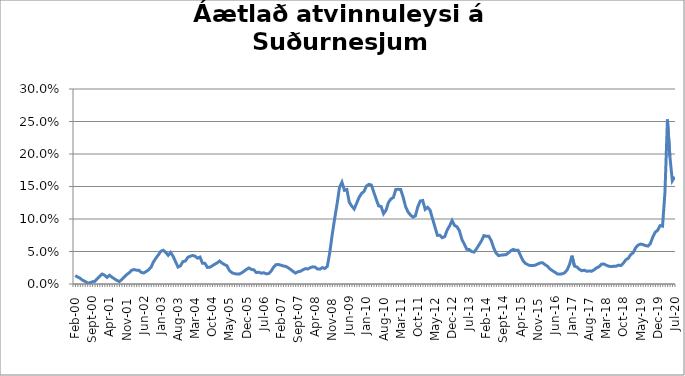
| Category | Series 0 |
|---|---|
| feb.00 | 0.013 |
| mar.00 | 0.011 |
| apr.00 | 0.009 |
| maí.00 | 0.006 |
| jún.00 | 0.004 |
| júl.00 | 0.002 |
| ágú.00 | 0.002 |
| sep.00 | 0.003 |
| okt.00 | 0.004 |
| nóv.00 | 0.008 |
| des.00 | 0.012 |
| jan.01 | 0.015 |
| feb.01 | 0.013 |
| mar.01 | 0.01 |
| apr.01 | 0.013 |
| maí.01 | 0.011 |
| jún.01 | 0.008 |
| júl.01 | 0.006 |
| ágú.01 | 0.004 |
| sep.01 | 0.007 |
| okt.01 | 0.011 |
| nóv.01 | 0.014 |
| des.01 | 0.017 |
| jan.02 | 0.021 |
| feb.02 | 0.022 |
| mar.02 | 0.021 |
| apr.02 | 0.021 |
| maí.02 | 0.018 |
| jún.02 | 0.017 |
| júl.02 | 0.019 |
| ágú.02 | 0.022 |
| sep.02 | 0.026 |
| okt.02 | 0.034 |
| nóv.02 | 0.04 |
| des.02 | 0.045 |
| jan.03 | 0.05 |
| feb.03 | 0.052 |
| mar.03 | 0.049 |
| apr.03 | 0.044 |
| maí.03 | 0.049 |
| jún.03 | 0.043 |
| júl.03 | 0.034 |
| ágú.03 | 0.026 |
| sep.03 | 0.028 |
| okt.03 | 0.034 |
| nóv.03 | 0.035 |
| des.03 | 0.041 |
| jan.04 | 0.043 |
| feb.04 | 0.044 |
| mar.04 | 0.043 |
| apr.04 | 0.04 |
| maí.04 | 0.041 |
| jún.04 | 0.032 |
| júl.04 | 0.032 |
| ágú.04 | 0.026 |
| sep.04 | 0.026 |
| okt.04 | 0.028 |
| nóv.04 | 0.03 |
| des.04 | 0.032 |
| jan.05 | 0.035 |
| feb.05 | 0.032 |
| mar.05 | 0.03 |
| apr.05 | 0.028 |
| maí.05 | 0.021 |
| jún.05 | 0.018 |
| júl.05 | 0.016 |
| ágú.05 | 0.015 |
| sep.05 | 0.015 |
| okt.05 | 0.017 |
| nóv.05 | 0.02 |
| des.05 | 0.023 |
| jan.06 | 0.025 |
| feb.06 | 0.022 |
| mar.06 | 0.022 |
| apr.06 | 0.018 |
| maí.06 | 0.018 |
| jún.06 | 0.017 |
| júl.06 | 0.017 |
| ágú.06 | 0.016 |
| sep.06 | 0.016 |
| okt.06 | 0.019 |
| nóv.06 | 0.026 |
| des.06 | 0.03 |
| jan.07 | 0.03 |
| feb.07 | 0.029 |
| mar.07 | 0.028 |
| apr.07 | 0.027 |
| maí.07 | 0.025 |
| jún.07 | 0.022 |
| júl.07 | 0.019 |
| ágú.07 | 0.017 |
| sep.07 | 0.019 |
| okt.07 | 0.02 |
| nóv.07 | 0.022 |
| des.07 | 0.024 |
| jan.08 | 0.023 |
| feb.08 | 0.025 |
| mar.08 | 0.026 |
| apr.08 | 0.026 |
| maí.08 | 0.023 |
| jún.08 | 0.023 |
| júl.08 | 0.025 |
| ágú.08 | 0.024 |
| sep.08 | 0.027 |
| okt.08 | 0.048 |
| nóv.08 | 0.075 |
| des.08 | 0.1 |
| jan.09 | 0.123 |
| feb.09 | 0.149 |
| mar.09 | 0.157 |
| apr.09 | 0.144 |
| maí.09 | 0.145 |
| jún.09 | 0.126 |
| júl.09 | 0.12 |
| ágú.09 | 0.115 |
| sep.09 | 0.124 |
| okt.09 | 0.133 |
| nóv.09 | 0.139 |
| des.09 | 0.142 |
| jan.10 | 0.151 |
| feb.10 | 0.153 |
| mar.10 | 0.152 |
| apr.10 | 0.141 |
| maí.10 | 0.13 |
| jún.10 | 0.12 |
| júl.10 | 0.119 |
| ágú.10 | 0.108 |
| sep.10 | 0.114 |
| okt.10 | 0.125 |
| nóv.10 | 0.131 |
| des.10 | 0.133 |
| jan.11 | 0.145 |
| feb.11 | 0.146 |
| mar.11 | 0.145 |
| apr.11 | 0.134 |
| maí.11 | 0.119 |
| jún.11 | 0.111 |
| júl.11 | 0.106 |
| ágú.11 | 0.103 |
| sep.11 | 0.105 |
| okt.11 | 0.119 |
| nóv.11 | 0.128 |
| des.11 | 0.128 |
| jan.12 | 0.115 |
| feb.12 | 0.118 |
| mar.12 | 0.114 |
| apr.12 | 0.101 |
| maí.12 | 0.088 |
| jún.12 | 0.075 |
| júl.12 | 0.075 |
| ágú.12 | 0.071 |
| sep.12 | 0.073 |
| okt.12 | 0.083 |
| nóv.12 | 0.09 |
| des.12 | 0.098 |
| jan.13 | 0.09 |
| feb.13 | 0.088 |
| mar.13 | 0.082 |
| apr.13 | 0.069 |
| maí.13 | 0.061 |
| jún.13 | 0.053 |
| júl.13 | 0.053 |
| ágú.13 | 0.05 |
| sep.13 | 0.049 |
| okt.13 | 0.054 |
| nóv.13 | 0.06 |
| des.13 | 0.066 |
| jan.14 | 0.074 |
| feb.14 | 0.073 |
| mar.14 | 0.073 |
| apr.14 | 0.067 |
| maí.14 | 0.055 |
| jún.14 | 0.048 |
| júl.14 | 0.044 |
| ágú.14 | 0.044 |
| sep.14 | 0.045 |
| okt.14 | 0.045 |
| nóv.14*** | 0.048 |
| des.14 | 0.051 |
| jan.15 | 0.053 |
| feb.15 | 0.052 |
| mar.15 | 0.052 |
| apr.15 | 0.044 |
| maí.15 | 0.036 |
| jún.15 | 0.032 |
| júl.15 | 0.03 |
| ágú.15 | 0.028 |
| sep.15 | 0.028 |
| okt.15 | 0.029 |
| nóv.15 | 0.031 |
| des.15 | 0.032 |
| jan.16 | 0.033 |
| feb.16 | 0.03 |
| mar.16 | 0.027 |
| apr.16 | 0.023 |
| maí.16 | 0.02 |
| jún.16 | 0.018 |
| júl.16 | 0.015 |
| ágú.16 | 0.015 |
| sep.16 | 0.016 |
| okt.16 | 0.017 |
| nóv.16 | 0.022 |
| des.16 | 0.03 |
| jan.17 | 0.044 |
| feb.17 | 0.028 |
| mar.17 | 0.026 |
| apr.17 | 0.023 |
| maí.17 | 0.02 |
| jún.17 | 0.021 |
| júl.17 | 0.02 |
| ágú.17 | 0.02 |
| sep.17 | 0.02 |
| okt.17 | 0.022 |
| nóv.17 | 0.025 |
| des.17 | 0.026 |
| jan.18 | 0.03 |
| feb.18 | 0.031 |
| mar.18 | 0.029 |
| apr.18 | 0.027 |
| maí.18 | 0.027 |
| jún.18 | 0.027 |
| júl.18 | 0.027 |
| ágú.18 | 0.029 |
| sep.18 | 0.028 |
| okt.18 | 0.032 |
| nóv.18 | 0.037 |
| des.18 | 0.039 |
| jan.19 | 0.045 |
| feb.19 | 0.048 |
| mar.19 | 0.056 |
| apr.19 | 0.06 |
| maí.19 | 0.061 |
| jún.19 | 0.061 |
| júl.19 | 0.059 |
| ágú.19 | 0.058 |
| sep.19 | 0.062 |
| okt.19 | 0.072 |
| nóv.19 | 0.08 |
| des.19 | 0.083 |
| jan.20 | 0.09 |
| feb.20 | 0.089 |
| mars 2020* | 0.142 |
| apr.20 | 0.253 |
| maí.20 | 0.196 |
| jún.20 | 0.159 |
| júl.20 | 0.165 |